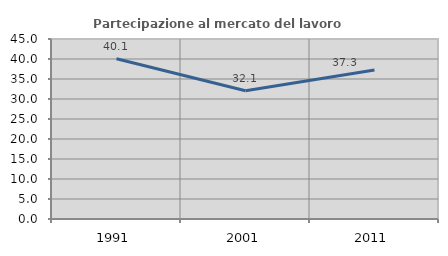
| Category | Partecipazione al mercato del lavoro  femminile |
|---|---|
| 1991.0 | 40.081 |
| 2001.0 | 32.07 |
| 2011.0 | 37.265 |